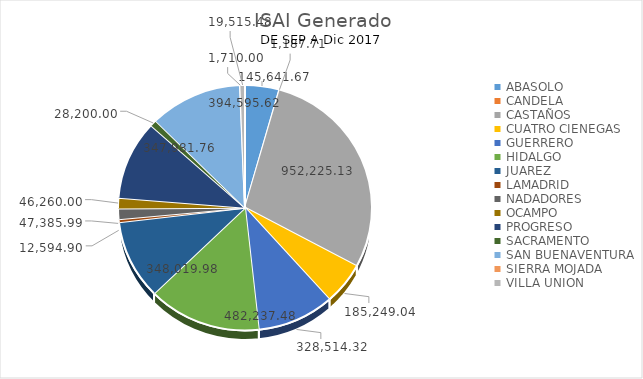
| Category | Series 0 |
|---|---|
| ABASOLO | 145641.67 |
| CANDELA | 1187.71 |
| CASTAÑOS | 952225.13 |
| CUATRO CIENEGAS | 185249.04 |
| GUERRERO | 328514.32 |
| HIDALGO | 482237.48 |
| JUAREZ | 348019.98 |
| LAMADRID | 12594.9 |
| NADADORES | 47385.99 |
| OCAMPO | 46260 |
| PROGRESO | 347981.76 |
| SACRAMENTO | 28200 |
| SAN BUENAVENTURA | 394595.62 |
| SIERRA MOJADA | 1710 |
| VILLA UNION | 19515.48 |